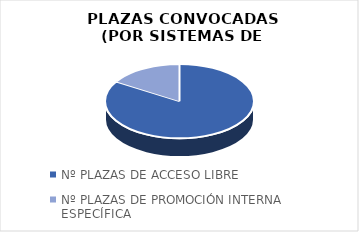
| Category | Series 0 |
|---|---|
| Nº PLAZAS DE ACCESO LIBRE | 4908 |
| Nº PLAZAS DE PROMOCIÓN INTERNA ESPECÍFICA | 944 |